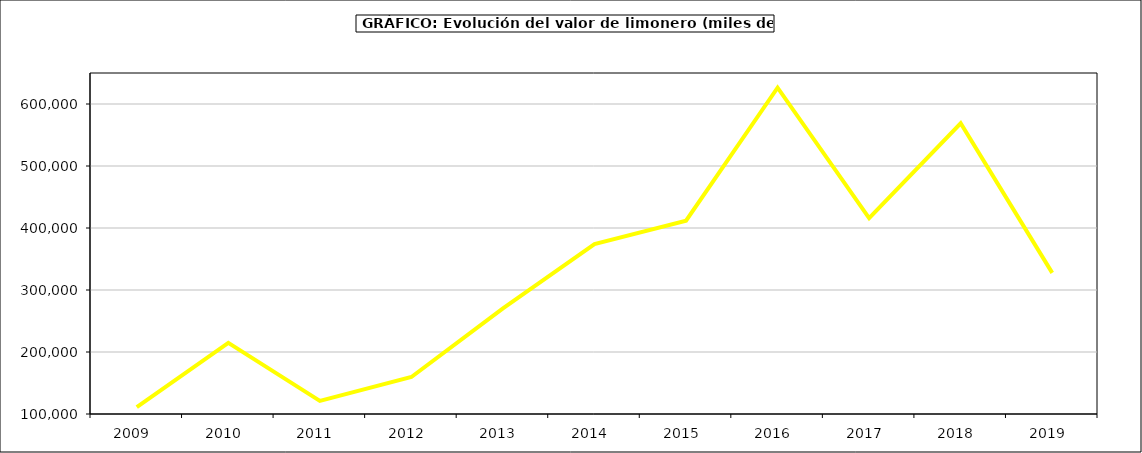
| Category | Valor |
|---|---|
| 2009.0 | 110910.366 |
| 2010.0 | 214653.894 |
| 2011.0 | 121030.951 |
| 2012.0 | 159689.894 |
| 2013.0 | 270510.614 |
| 2014.0 | 373950.238 |
| 2015.0 | 411737 |
| 2016.0 | 626329 |
| 2017.0 | 415897.996 |
| 2018.0 | 568828.291 |
| 2019.0 | 327602.422 |